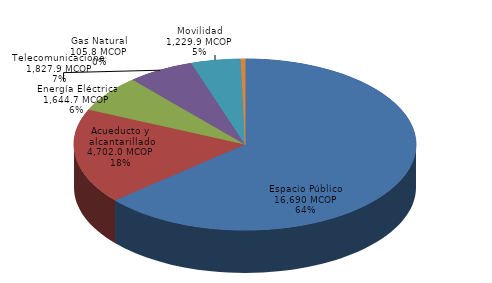
| Category | Series 0 |
|---|---|
| Espacio Público | 16690.136 |
| Acueducto y alcantarillado | 4702.039 |
| Telecomunicaciones | 1827.891 |
| Energía Eléctrica | 1644.722 |
| Movilidad | 1229.867 |
| Gas Natural | 105.831 |